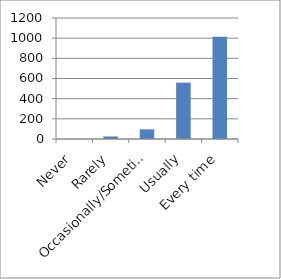
| Category | Series 0 |
|---|---|
|  Never | 1 |
| Rarely | 25 |
|  Occasionally/Sometimes | 96 |
| Usually | 559 |
| Every time | 1015 |